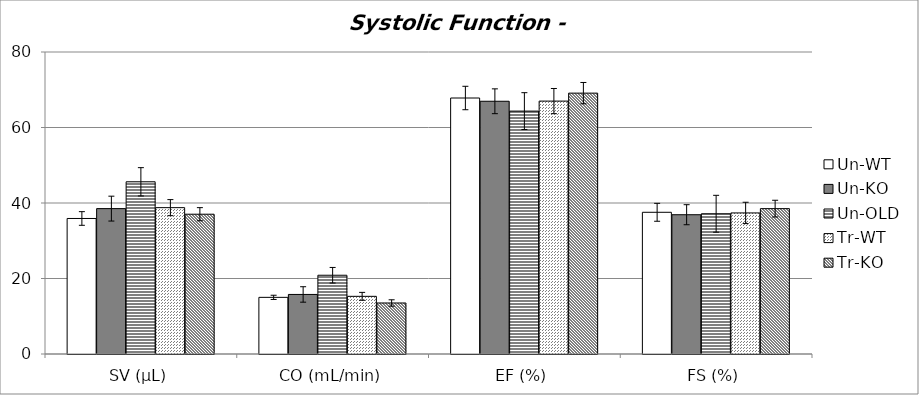
| Category | Un-WT | Un-KO | Un-OLD | Tr-WT | Tr-KO |
|---|---|---|---|---|---|
| SV (μL) | 35.9 | 38.512 | 45.615 | 38.77 | 37.032 |
| CO (mL/min) | 15.005 | 15.774 | 20.865 | 15.275 | 13.515 |
| EF (%) | 67.812 | 66.951 | 64.342 | 66.995 | 69.106 |
| FS (%) | 37.538 | 36.895 | 37.151 | 37.371 | 38.51 |